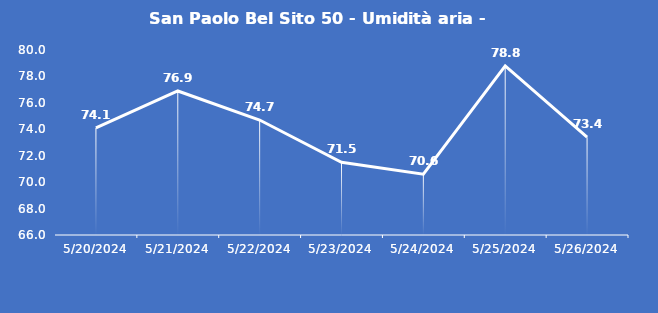
| Category | San Paolo Bel Sito 50 - Umidità aria - Grezzo (%) |
|---|---|
| 5/20/24 | 74.1 |
| 5/21/24 | 76.9 |
| 5/22/24 | 74.7 |
| 5/23/24 | 71.5 |
| 5/24/24 | 70.6 |
| 5/25/24 | 78.8 |
| 5/26/24 | 73.4 |